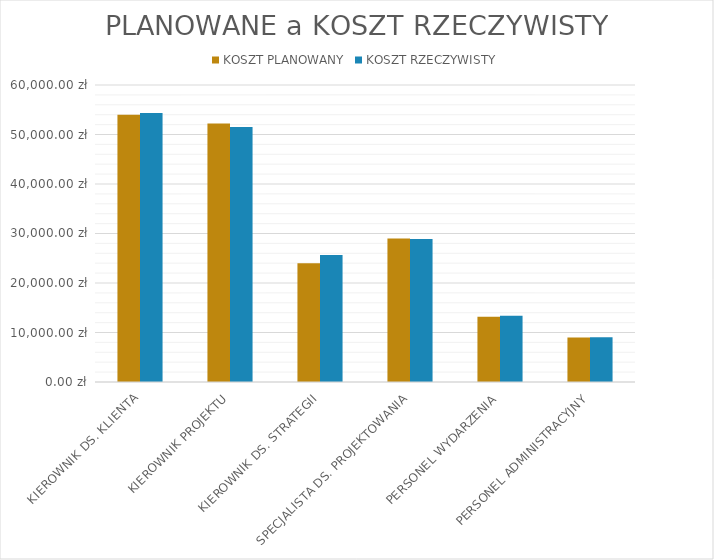
| Category | KOSZT PLANOWANY | KOSZT RZECZYWISTY |
|---|---|---|
| KIEROWNIK DS. KLIENTA | 54000 | 54360 |
| KIEROWNIK PROJEKTU | 52200 | 51540 |
| KIEROWNIK DS. STRATEGII | 24000 | 25650 |
| SPECJALISTA DS. PROJEKTOWANIA | 29000 | 28900 |
| PERSONEL WYDARZENIA | 13200 | 13400 |
| PERSONEL ADMINISTRACYJNY | 9000 | 9060 |